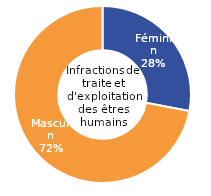
| Category | Infraction de traite ou d'exploitation des êtres humains |
|---|---|
| Féminin | 28 |
| Masculin | 72 |